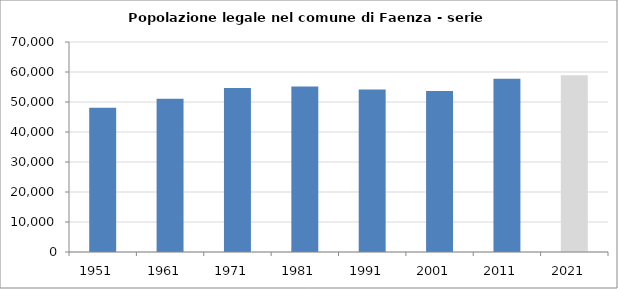
| Category | Popolazione residente |
|---|---|
| 1951   | 48045 |
| 1961   | 51077 |
| 1971   | 54694 |
| 1981   | 55158 |
| 1991   | 54139 |
| 2001   | 53641 |
| 2011   | 57748 |
| 2021   | 58899 |